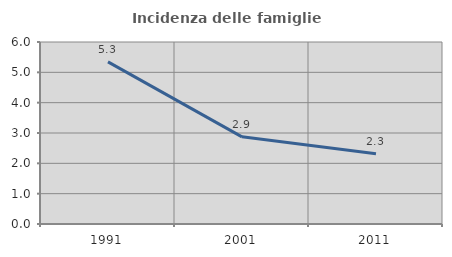
| Category | Incidenza delle famiglie numerose |
|---|---|
| 1991.0 | 5.345 |
| 2001.0 | 2.874 |
| 2011.0 | 2.314 |